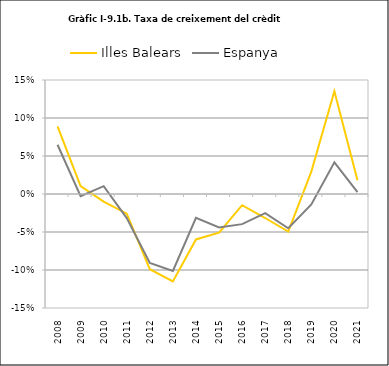
| Category | Illes Balears | Espanya |
|---|---|---|
| 2008.0 | 0.089 | 0.065 |
| 2009.0 | 0.01 | -0.003 |
| 2010.0 | -0.01 | 0.01 |
| 2011.0 | -0.026 | -0.032 |
| 2012.0 | -0.099 | -0.091 |
| 2013.0 | -0.115 | -0.101 |
| 2014.0 | -0.06 | -0.031 |
| 2015.0 | -0.051 | -0.044 |
| 2016.0 | -0.015 | -0.04 |
| 2017.0 | -0.032 | -0.025 |
| 2018.0 | -0.049 | -0.045 |
| 2019.0 | 0.03 | -0.014 |
| 2020.0 | 0.135 | 0.042 |
| 2021.0 | 0.018 | 0.002 |